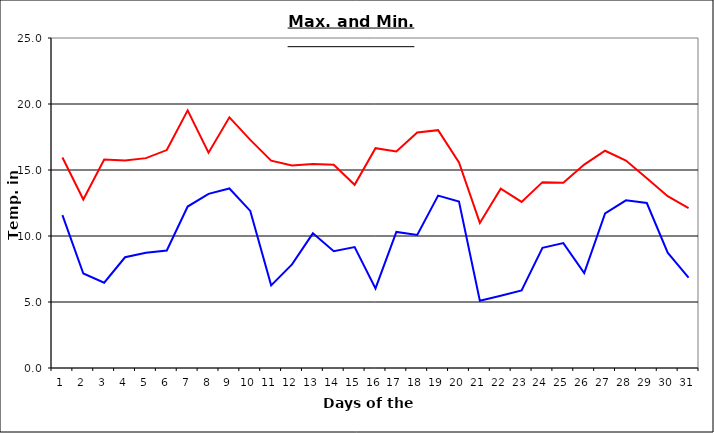
| Category | Series 0 | Series 1 |
|---|---|---|
| 0 | 15.95 | 11.58 |
| 1 | 12.77 | 7.16 |
| 2 | 15.79 | 6.46 |
| 3 | 15.72 | 8.39 |
| 4 | 15.9 | 8.73 |
| 5 | 16.51 | 8.9 |
| 6 | 19.52 | 12.23 |
| 7 | 16.31 | 13.19 |
| 8 | 18.99 | 13.6 |
| 9 | 17.28 | 11.9 |
| 10 | 15.71 | 6.26 |
| 11 | 15.35 | 7.85 |
| 12 | 15.46 | 10.2 |
| 13 | 15.39 | 8.85 |
| 14 | 13.88 | 9.16 |
| 15 | 16.65 | 6.03 |
| 16 | 16.4 | 10.31 |
| 17 | 17.84 | 10.08 |
| 18 | 18.02 | 13.06 |
| 19 | 15.58 | 12.61 |
| 20 | 10.99 | 5.1 |
| 21 | 13.58 | 5.48 |
| 22 | 12.58 | 5.87 |
| 23 | 14.08 | 9.11 |
| 24 | 14.03 | 9.46 |
| 25 | 15.41 | 7.2 |
| 26 | 16.46 | 11.72 |
| 27 | 15.72 | 12.7 |
| 28 | 14.38 | 12.5 |
| 29 | 13.02 | 8.74 |
| 30 | 12.11 | 6.84 |